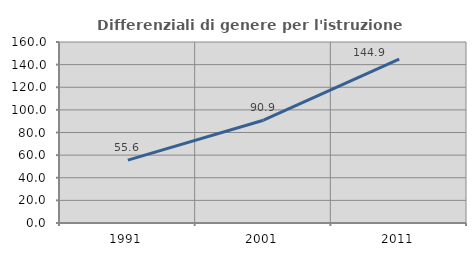
| Category | Differenziali di genere per l'istruzione superiore |
|---|---|
| 1991.0 | 55.556 |
| 2001.0 | 90.877 |
| 2011.0 | 144.878 |